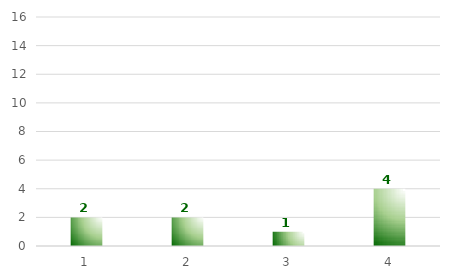
| Category | Series 0 |
|---|---|
| 0 | 2 |
| 1 | 2 |
| 2 | 1 |
| 3 | 4 |